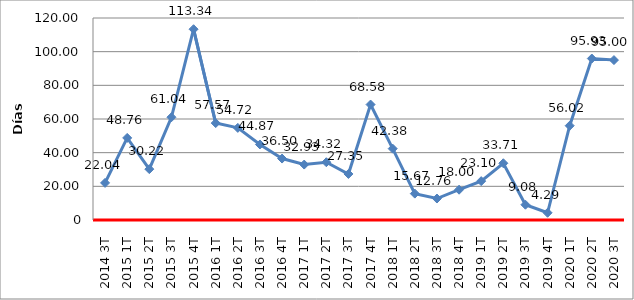
| Category | Total |
|---|---|
| 2014 3T | 22.04 |
| 2015 1T | 48.76 |
| 2015 2T | 30.22 |
| 2015 3T | 61.04 |
| 2015 4T | 113.34 |
| 2016 1T | 57.57 |
| 2016 2T | 54.72 |
| 2016 3T | 44.87 |
| 2016 4T | 36.5 |
| 2017 1T | 32.93 |
| 2017 2T | 34.32 |
| 2017 3T | 27.35 |
| 2017 4T | 68.58 |
| 2018 1T | 42.38 |
| 2018 2T | 15.67 |
| 2018 3T | 12.76 |
| 2018 4T | 18 |
| 2019 1T | 23.1 |
| 2019 2T | 33.71 |
| 2019 3T | 9.08 |
| 2019 4T | 4.29 |
| 2020 1T | 56.02 |
| 2020 2T | 95.93 |
| 2020 3T | 95 |